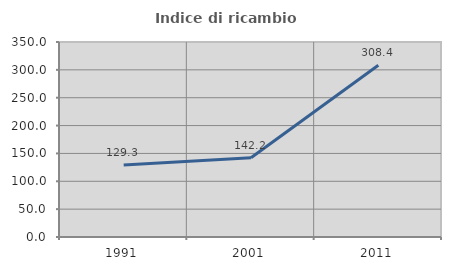
| Category | Indice di ricambio occupazionale  |
|---|---|
| 1991.0 | 129.277 |
| 2001.0 | 142.222 |
| 2011.0 | 308.391 |